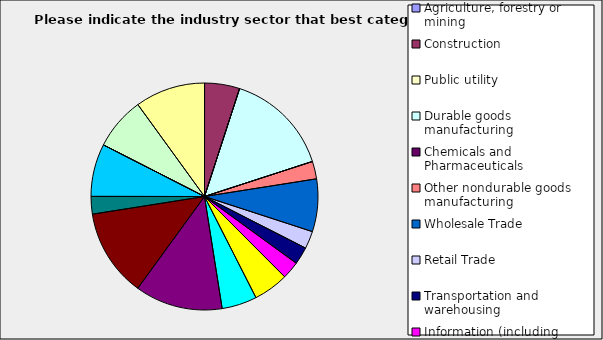
| Category | Series 0 |
|---|---|
| Agriculture, forestry or mining | 0 |
| Construction | 0.05 |
| Public utility | 0 |
| Durable goods manufacturing | 0.15 |
| Chemicals and Pharmaceuticals | 0 |
| Other nondurable goods manufacturing | 0.025 |
| Wholesale Trade | 0.075 |
| Retail Trade | 0.025 |
| Transportation and warehousing | 0.025 |
| Information (including broadcasting and telecommunication) | 0.025 |
| Finance and Insurance | 0.05 |
| Real Estate | 0.05 |
| Professional, scientific and technical services | 0.125 |
| Consulting | 0.125 |
| Administrative and office services (including waste management) | 0.025 |
| Education | 0 |
| Health Care and social services | 0.075 |
| Arts, entertainment and recreation | 0 |
| Accommodation and food services | 0.075 |
| Other | 0.1 |